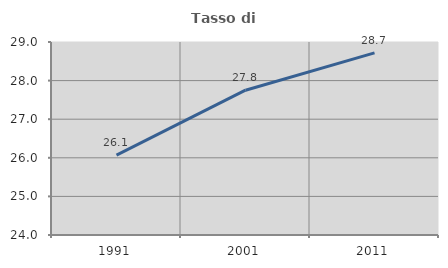
| Category | Tasso di occupazione   |
|---|---|
| 1991.0 | 26.069 |
| 2001.0 | 27.751 |
| 2011.0 | 28.718 |